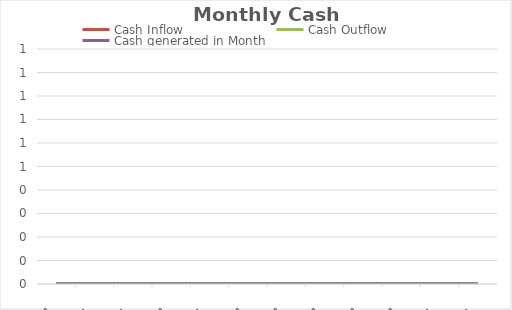
| Category | Series 0 | Cash Inflow | Cash Outflow | Cash generated in Month |
|---|---|---|---|---|
| 2021-01-01 | 0 | 0 | 0 | 0 |
| 2021-02-01 | 0 | 0 | 0 | 0 |
| 2021-03-01 | 0 | 0 | 0 | 0 |
| 2021-04-01 | 0 | 0 | 0 | 0 |
| 2021-05-01 | 0 | 0 | 0 | 0 |
| 2021-06-01 | 0 | 0 | 0 | 0 |
| 2021-07-01 | 0 | 0 | 0 | 0 |
| 2021-08-01 | 0 | 0 | 0 | 0 |
| 2021-09-01 | 0 | 0 | 0 | 0 |
| 2021-10-01 | 0 | 0 | 0 | 0 |
| 2021-11-01 | 0 | 0 | 0 | 0 |
| 2021-12-01 | 0 | 0 | 0 | 0 |